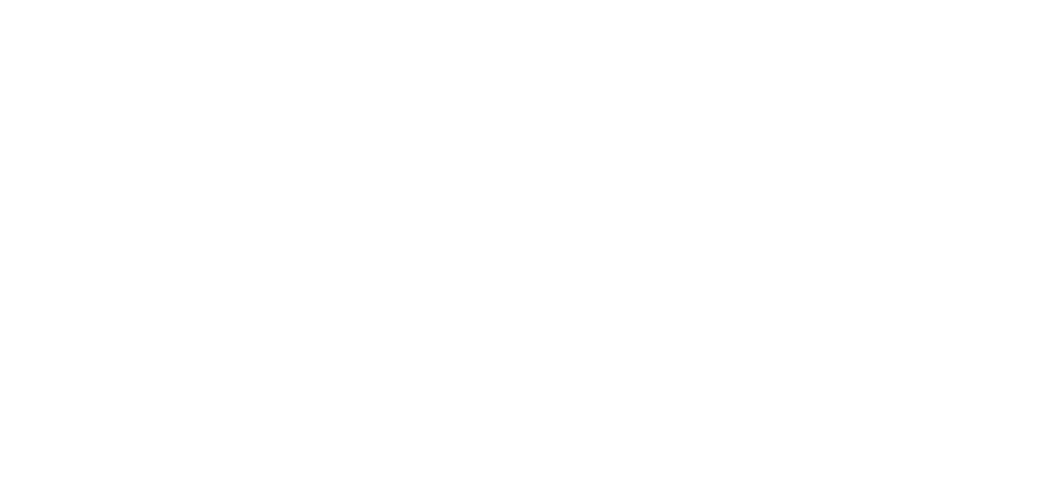
| Category | Total |
|---|---|
| Al Hodeidah | 579 |
| Hajjah | 484 |
| Marib | 212 |
| Taiz | 202 |
| Al Jawf | 171 |
| Amran | 148 |
| Hadramawt | 104 |
| Ad Dali | 96 |
| Lahj | 77 |
| Abyan | 65 |
| Ibb | 57 |
| Sanaa | 51 |
| Sadah | 46 |
| Aden | 41 |
| Al Bayda | 37 |
| Dhamar | 22 |
| Shabwah | 19 |
| Al Maharah | 12 |
| Raymah | 8 |
| Al Mahwit | 8 |
| Sanaa City | 4 |
| Socotra | 1 |